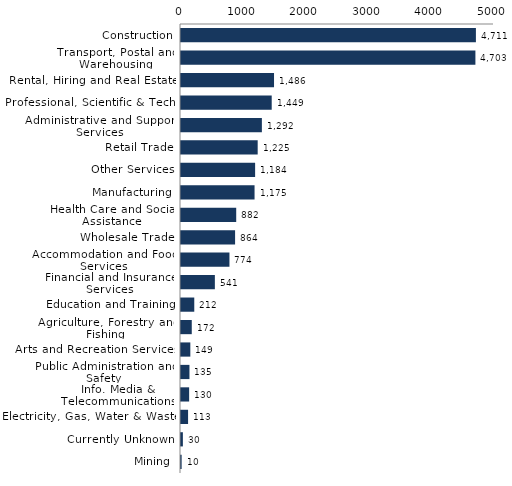
| Category | Series 0 |
|---|---|
| Construction | 4711 |
| Transport, Postal and Warehousing | 4703 |
| Rental, Hiring and Real Estate | 1486 |
| Professional, Scientific & Tech. | 1449 |
| Administrative and Support Services | 1292 |
| Retail Trade | 1225 |
| Other Services | 1184 |
| Manufacturing | 1175 |
| Health Care and Social Assistance | 882 |
| Wholesale Trade | 864 |
| Accommodation and Food Services | 774 |
| Financial and Insurance Services | 541 |
| Education and Training | 212 |
| Agriculture, Forestry and Fishing | 172 |
| Arts and Recreation Services | 149 |
| Public Administration and Safety | 135 |
| Info. Media & Telecommunications | 130 |
| Electricity, Gas, Water & Waste | 113 |
| Currently Unknown | 30 |
| Mining | 10 |